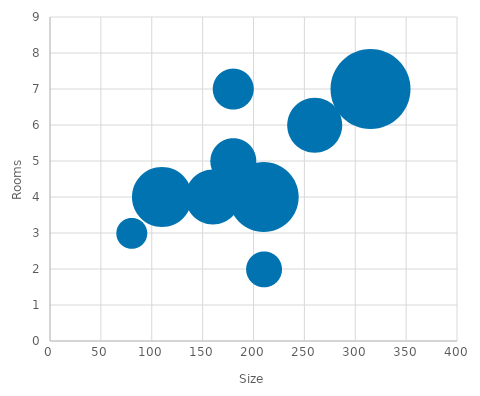
| Category | Series 0 |
|---|---|
| 180.0 | 7 |
| 210.0 | 2 |
| 80.0 | 3 |
| 110.0 | 4 |
| 160.0 | 4 |
| 210.0 | 4 |
| 260.0 | 6 |
| 180.0 | 5 |
| 315.0 | 7 |